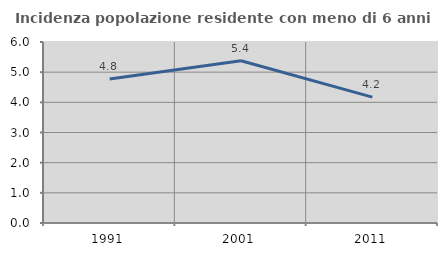
| Category | Incidenza popolazione residente con meno di 6 anni |
|---|---|
| 1991.0 | 4.772 |
| 2001.0 | 5.379 |
| 2011.0 | 4.172 |